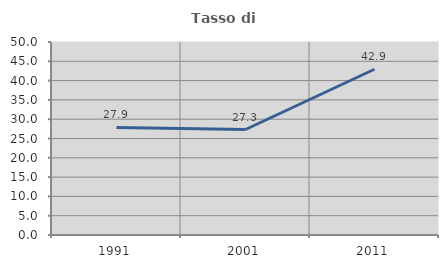
| Category | Tasso di occupazione   |
|---|---|
| 1991.0 | 27.863 |
| 2001.0 | 27.329 |
| 2011.0 | 42.941 |